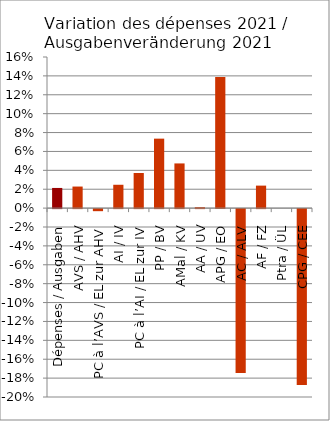
| Category | Series 0 |
|---|---|
| Dépenses / Ausgaben | 0.021 |
| AVS / AHV | 0.023 |
| PC à l’AVS / EL zur AHV | -0.002 |
| AI / IV | 0.025 |
| PC à l’AI / EL zur IV | 0.037 |
| PP / BV | 0.074 |
| AMal / KV | 0.047 |
| AA / UV | 0.001 |
| APG / EO | 0.139 |
| AC / ALV | -0.173 |
| AF / FZ | 0.024 |
| Ptra / ÜL | 0 |
| CPG / CEE | -0.186 |